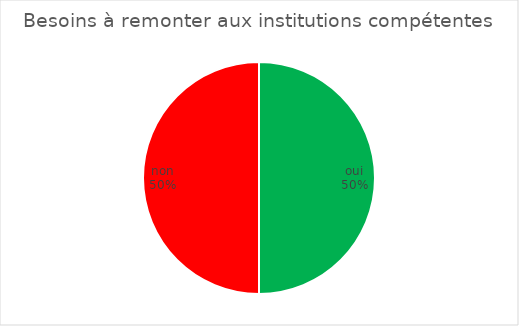
| Category | Besoins à remonter aux institutions compétentes (Demander un support à l'AVIQ pour chaque critère qui n'est pas rempli)  |
|---|---|
| oui | 6 |
| non | 6 |